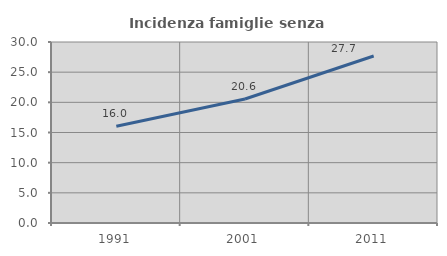
| Category | Incidenza famiglie senza nuclei |
|---|---|
| 1991.0 | 16.035 |
| 2001.0 | 20.554 |
| 2011.0 | 27.681 |